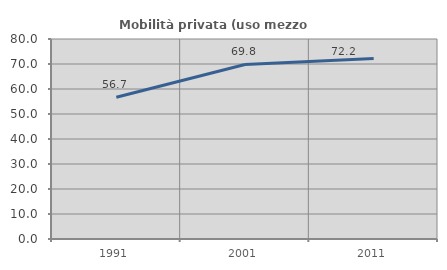
| Category | Mobilità privata (uso mezzo privato) |
|---|---|
| 1991.0 | 56.673 |
| 2001.0 | 69.805 |
| 2011.0 | 72.21 |